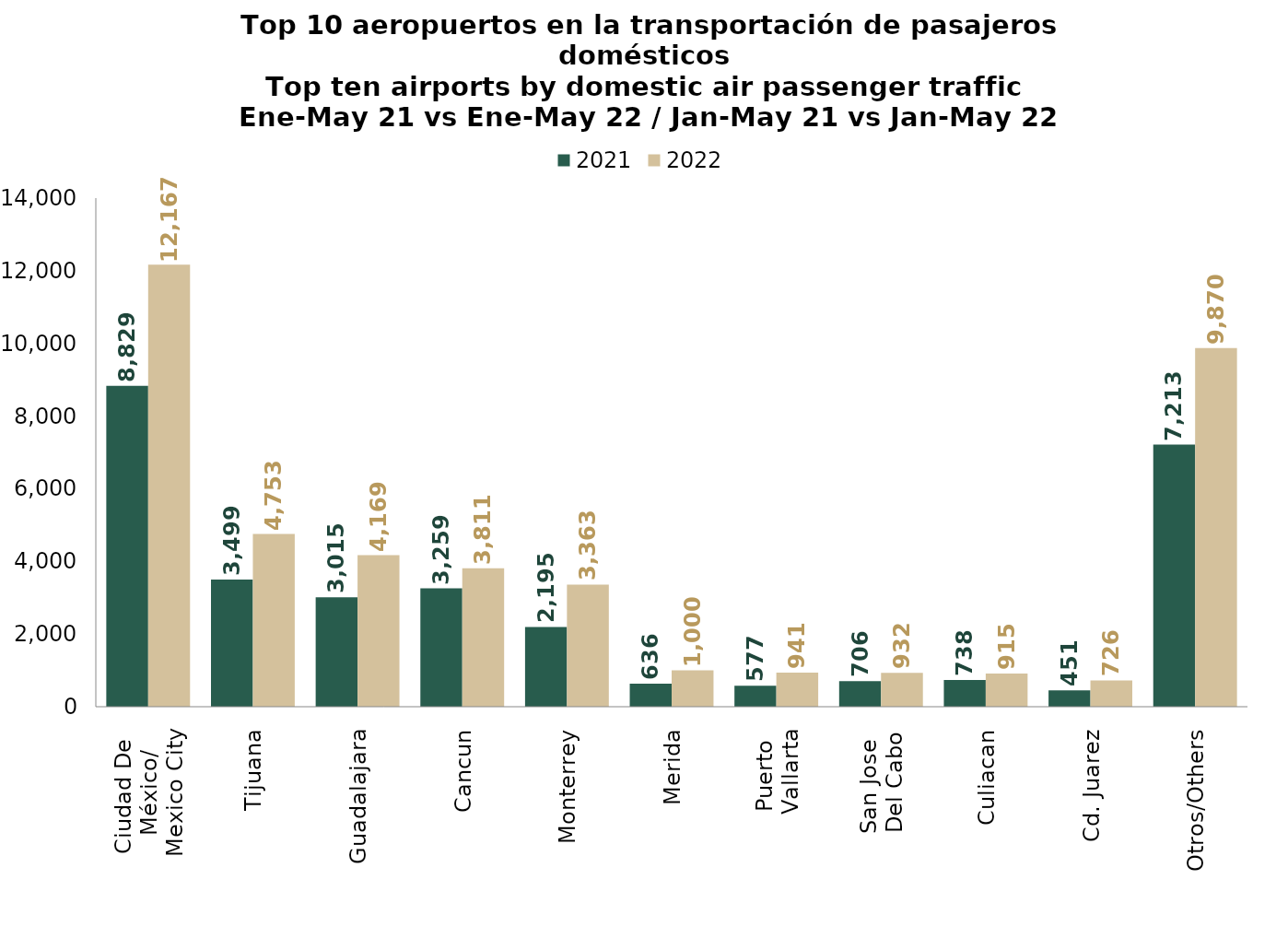
| Category | 2021 | 2022 |
|---|---|---|
| Ciudad De 
México/
Mexico City | 8829.446 | 12167.056 |
| Tijuana | 3498.894 | 4753.203 |
| Guadalajara | 3014.521 | 4169.209 |
| Cancun | 3258.643 | 3811.066 |
| Monterrey | 2195.37 | 3362.652 |
| Merida | 635.541 | 1000.126 |
| Puerto 
Vallarta | 577.483 | 940.815 |
| San Jose 
Del Cabo | 705.932 | 932.207 |
| Culiacan | 738.236 | 914.803 |
| Cd. Juarez | 450.779 | 725.827 |
| Otros/Others | 7212.728 | 9869.75 |